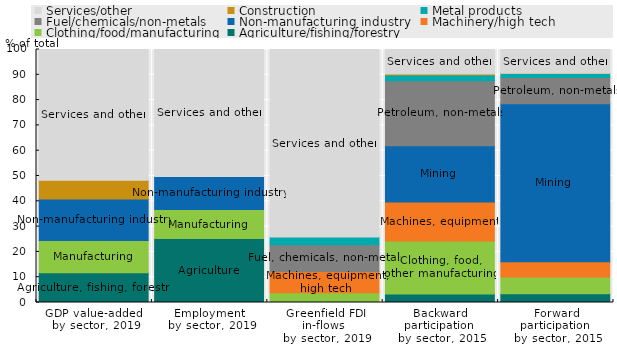
| Category | Agriculture/fishing/forestry | Clothing/food/manufacturing | Machinery/high tech | Non-manufacturing industry | Fuel/chemicals/non-metals | Metal products | Construction | Services/other |
|---|---|---|---|---|---|---|---|---|
| GDP value-added 
by sector, 2019 | 11.739 | 12.78 | 0 | 16.406 | 0 | 0 | 7.352 | 51.722 |
| Employment 
by sector, 2019 | 25.258 | 11.537 | 0 | 13.053 | 0 | 0 | 0 | 50.152 |
| Greenfield FDI in-flows 
by sector, 2019 | 0 | 3.856 | 8.433 | 0 | 10.586 | 3.052 | 0 | 74.073 |
| Backward participation 
by sector, 2015 | 3.401 | 20.879 | 15.458 | 22.176 | 25.697 | 2.29 | 0.372 | 9.728 |
| Forward participation 
by sector, 2015 | 3.434 | 6.644 | 6.066 | 62.445 | 10.308 | 1.578 | 0.179 | 9.347 |